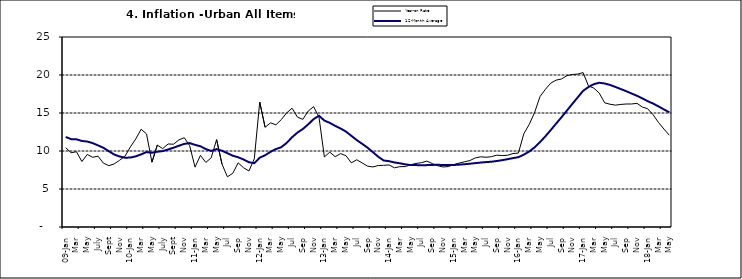
| Category | Year-on Rate | 12-Month Average |
|---|---|---|
| 09-Jan | 10.439 | 11.844 |
| Feb | 9.772 | 11.562 |
| Mar | 9.907 | 11.538 |
| Apr | 8.618 | 11.319 |
| May | 9.547 | 11.246 |
| June | 9.17 | 11.039 |
| July | 9.325 | 10.738 |
| Aug | 8.401 | 10.424 |
| Sept | 8.07 | 9.973 |
| Oct | 8.3 | 9.535 |
| Nov | 8.781 | 9.278 |
| Dec | 9.298 | 9.117 |
| 10-Jan | 10.534 | 9.136 |
| Feb | 11.584 | 9.297 |
| Mar | 12.864 | 9.555 |
| Apr | 12.24 | 9.859 |
| May | 8.524 | 9.769 |
| June | 10.781 | 9.904 |
| July | 10.313 | 9.987 |
| Aug | 10.924 | 10.197 |
| Sept | 10.891 | 10.43 |
| Oct | 11.457 | 10.689 |
| Nov | 11.748 | 10.932 |
| Dec | 10.699 | 11.042 |
| 11-Jan | 7.878 | 10.806 |
| Feb | 9.426 | 10.623 |
| Mar | 8.498 | 10.26 |
| Apr | 9.11 | 10.005 |
| May | 11.5 | 10.249 |
| Jun | 8.278 | 10.034 |
| Jul | 6.608 | 9.711 |
| Aug | 7.061 | 9.38 |
| Sep | 8.443 | 9.178 |
| Oct | 7.802 | 8.88 |
| Nov | 7.365 | 8.525 |
| Dec | 8.993 | 8.395 |
| 12-Jan | 16.445 | 9.119 |
| Feb | 13.123 | 9.443 |
| Mar | 13.701 | 9.889 |
| Apr | 13.447 | 10.259 |
| May | 14.127 | 10.496 |
| Jun | 15.012 | 11.062 |
| Jul | 15.63 | 11.81 |
| Aug | 14.456 | 12.422 |
| Sep | 14.162 | 12.893 |
| Oct | 15.26 | 13.506 |
| Nov | 15.836 | 14.199 |
| Dec | 14.459 | 14.637 |
| 13-Jan | 9.22 | 14.006 |
| Feb | 9.85 | 13.703 |
| Mar | 9.253 | 13.302 |
| Apr | 9.657 | 12.966 |
| May | 9.385 | 12.557 |
| Jun | 8.441 | 11.999 |
| Jul | 8.849 | 11.443 |
| Aug | 8.431 | 10.946 |
| Sep | 8.013 | 10.44 |
| Oct | 7.9 | 9.849 |
| Nov | 8.086 | 9.245 |
| Dec | 8.117 | 8.75 |
| 14-Jan | 8.164 | 8.662 |
| Feb | 7.791 | 8.493 |
| Mar | 7.937 | 8.384 |
| Apr | 7.947 | 8.246 |
| May | 8.195 | 8.151 |
| Jun | 8.358 | 8.146 |
| Jul | 8.464 | 8.118 |
| Aug | 8.673 | 8.141 |
| Sep | 8.357 | 8.17 |
| Oct | 8.064 | 8.182 |
| Nov | 7.902 | 8.165 |
| Dec | 7.948 | 8.151 |
| 15-Jan | 8.211 | 8.155 |
| Feb | 8.412 | 8.206 |
| Mar | 8.579 | 8.26 |
| Apr | 8.742 | 8.326 |
| May | 9.092 | 8.403 |
| Jun | 9.232 | 8.478 |
| Jul | 9.177 | 8.54 |
| Aug | 9.25 | 8.591 |
| Sep | 9.455 | 8.684 |
| Oct | 9.398 | 8.795 |
| Nov | 9.442 | 8.922 |
| Dec | 9.665 | 9.064 |
| 16-Jan | 9.728 | 9.19 |
| Feb | 12.254 | 9.516 |
| Mar | 13.485 | 9.935 |
| Apr | 15.052 | 10.474 |
| May | 17.148 | 11.165 |
| Jun | 18.111 | 11.925 |
| Jul | 18.927 | 12.754 |
| Aug | 19.325 | 13.605 |
| Sep | 19.476 | 14.444 |
| Oct | 19.914 | 15.318 |
| Nov | 20.067 | 16.193 |
| Dec | 20.118 | 17.05 |
| 17-Jan | 20.315 | 17.914 |
| Feb | 18.569 | 18.418 |
| Mar | 18.27 | 18.794 |
| Apr | 17.621 | 18.982 |
| May | 16.343 | 18.883 |
| Jun | 16.153 | 18.692 |
| Jul | 16.038 | 18.43 |
| Aug | 16.128 | 18.151 |
| Sep | 16.183 | 17.872 |
| Oct | 16.187 | 17.567 |
| Nov | 16.267 | 17.264 |
| Dec | 15.785 | 16.921 |
| 18-Jan | 15.559 | 16.55 |
| Feb | 14.763 | 16.241 |
| Mar | 13.748 | 15.866 |
| Apr | 12.893 | 15.468 |
| May | 12.077 | 15.096 |